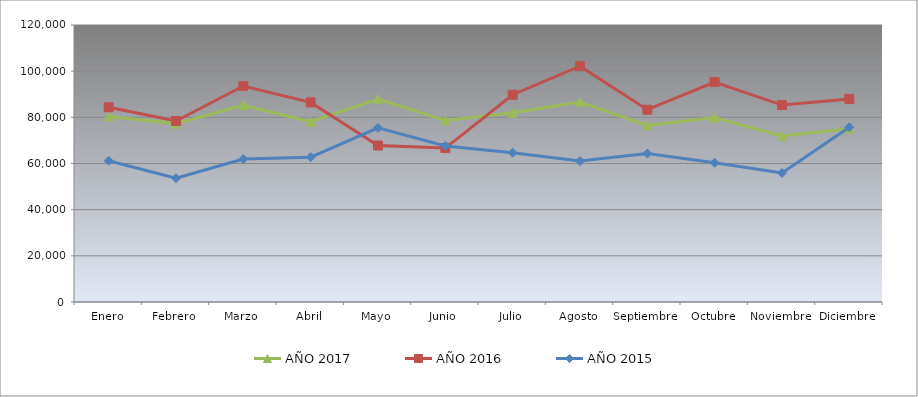
| Category | AÑO 2017 | AÑO 2016 | AÑO 2015 |
|---|---|---|---|
| Enero | 80409.339 | 84353.266 | 61204.445 |
| Febrero | 77283.319 | 78419.656 | 53615.22 |
| Marzo | 85234.738 | 93584.2 | 61916.677 |
| Abril | 78115.525 | 86470.164 | 62747.614 |
| Mayo | 87913.184 | 67787.95 | 75433.252 |
| Junio | 78598.065 | 66686.218 | 67614.53 |
| Julio | 81982.838 | 89798.966 | 64670.639 |
| Agosto | 86619.418 | 102161.964 | 61038.258 |
| Septiembre | 76423.139 | 83314.491 | 64298.696 |
| Octubre | 79947.779 | 95284.014 | 60302.285 |
| Noviembre | 71912.439 | 85321.215 | 55886.448 |
| Diciembre | 75080.419 | 87973.24 | 75718.144 |